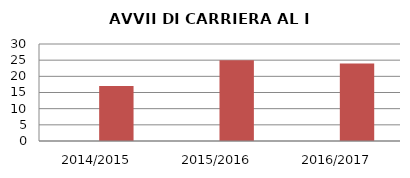
| Category | ANNO | NUMERO |
|---|---|---|
| 2014/2015 | 0 | 17 |
| 2015/2016 | 0 | 25 |
| 2016/2017 | 0 | 24 |